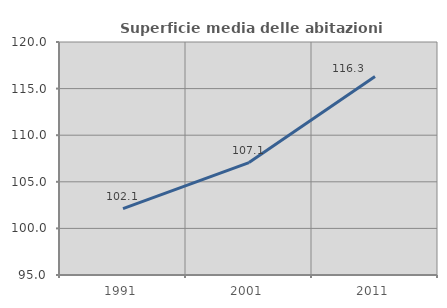
| Category | Superficie media delle abitazioni occupate |
|---|---|
| 1991.0 | 102.114 |
| 2001.0 | 107.062 |
| 2011.0 | 116.294 |